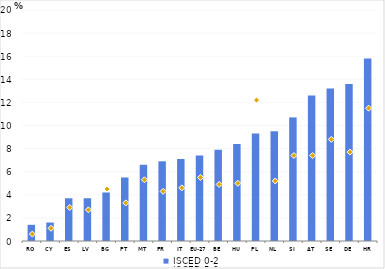
| Category | ISCED 0-2 |
|---|---|
| RO | 1.4 |
| CY | 1.6 |
| ES | 3.7 |
| LV | 3.7 |
| BG | 4.2 |
| PT | 5.5 |
| MT | 6.6 |
| FR | 6.9 |
| IT | 7.1 |
| EU-27 | 7.4 |
| BE | 7.9 |
| HU | 8.4 |
| PL | 9.3 |
| NL | 9.5 |
| SI | 10.7 |
| AT | 12.6 |
| SE | 13.2 |
| DE | 13.6 |
| HR | 15.8 |